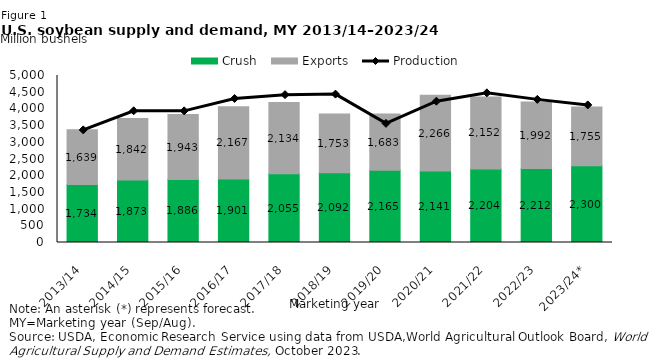
| Category | Crush | Exports |
|---|---|---|
| 2013/14 | 1734 | 1638.559 |
| 2014/15 | 1873 | 1842.175 |
| 2015/16 | 1886.237 | 1942.606 |
| 2016/17 | 1901.198 | 2166.551 |
| 2017/18 | 2054.932 | 2133.731 |
| 2018/19 | 2091.99 | 1753.43 |
| 2019/20 | 2164.554 | 1682.875 |
| 2020/21 | 2140.585 | 2265.762 |
| 2021/22 | 2203.872 | 2152.114 |
| 2022/23 | 2211.938 | 1991.816 |
| 2023/24* | 2300 | 1755 |